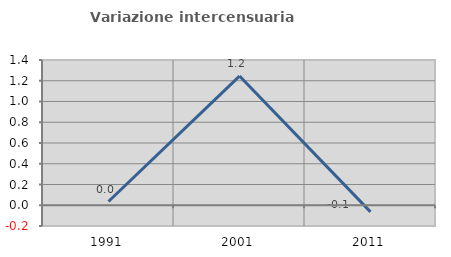
| Category | Variazione intercensuaria annua |
|---|---|
| 1991.0 | 0.036 |
| 2001.0 | 1.245 |
| 2011.0 | -0.064 |